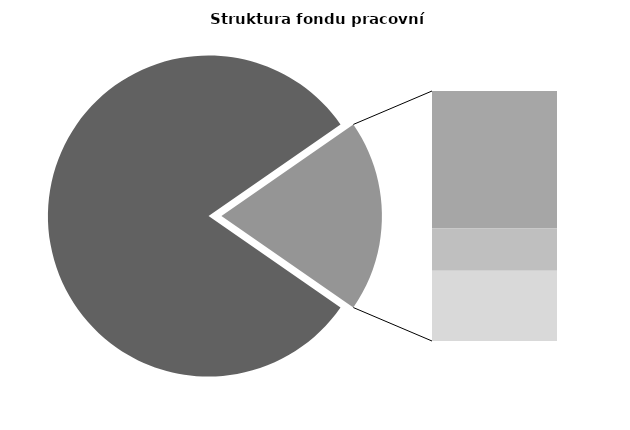
| Category | Series 0 |
|---|---|
| Průměrná měsíční odpracovaná doba bez přesčasu | 138.816 |
| Dovolená | 18.248 |
| Nemoc | 5.626 |
| Jiné | 9.346 |